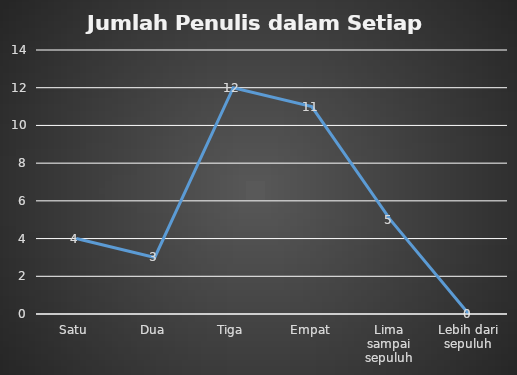
| Category | Series 0 |
|---|---|
| Satu | 4 |
| Dua | 3 |
| Tiga | 12 |
| Empat | 11 |
| Lima sampai sepuluh | 5 |
| Lebih dari sepuluh | 0 |